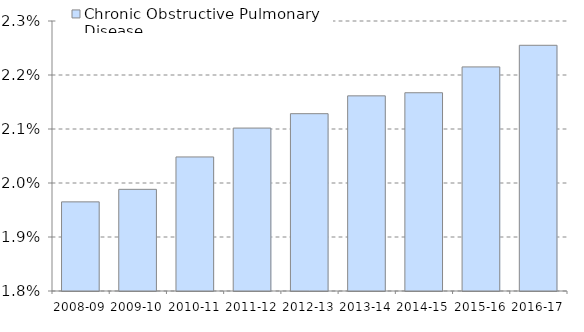
| Category | Chronic Obstructive Pulmonary Disease  |
|---|---|
| 2008-09 | 0.02 |
| 2009-10 | 0.02 |
| 2010-11 | 0.02 |
| 2011-12 | 0.021 |
| 2012-13 | 0.021 |
| 2013-14 | 0.022 |
| 2014-15 | 0.022 |
| 2015-16 | 0.022 |
| 2016-17 | 0.023 |